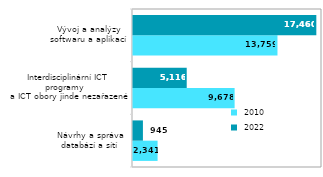
| Category |  2010 |  2022 |
|---|---|---|
| Návrhy a správa
databází a sítí | 2341 | 945 |
|   Interdisciplinární ICT programy
  a ICT obory jinde nezařazené | 9678 | 5116 |
| Vývoj a analýzy
softwaru a aplikací | 13759 | 17460 |